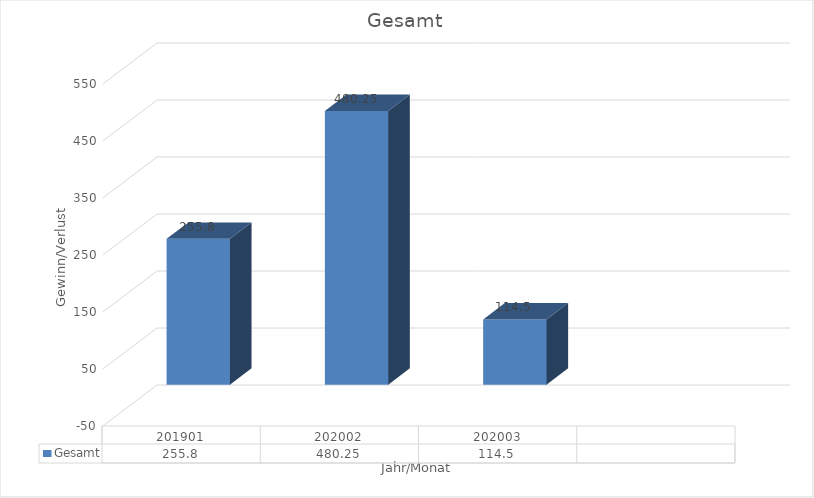
| Category | Gesamt |
|---|---|
| 201901 | 255.8 |
| 202002 | 480.25 |
| 202003 | 114.5 |